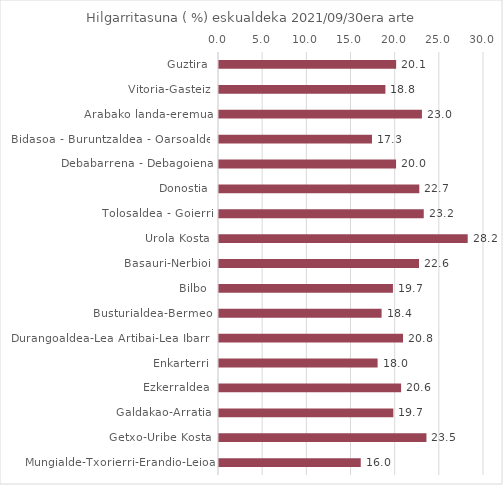
| Category | Series 0 |
|---|---|
| Guztira | 20.055 |
| Vitoria-Gasteiz | 18.839 |
| Arabako landa-eremua | 22.973 |
| Bidasoa - Buruntzaldea - Oarsoaldea | 17.318 |
| Debabarrena - Debagoiena | 20.047 |
| Donostia | 22.674 |
| Tolosaldea - Goierri | 23.181 |
| Urola Kosta | 28.155 |
| Basauri-Nerbioi | 22.642 |
| Bilbo | 19.692 |
| Busturialdea-Bermeo | 18.408 |
| Durangoaldea-Lea Artibai-Lea Ibarra | 20.833 |
| Enkarterri | 17.955 |
| Ezkerraldea | 20.613 |
| Galdakao-Arratia | 19.737 |
| Getxo-Uribe Kosta | 23.485 |
| Mungialde-Txorierri-Erandio-Leioa | 16.047 |